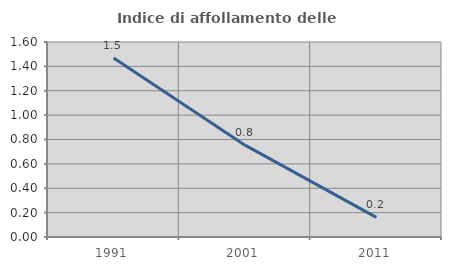
| Category | Indice di affollamento delle abitazioni  |
|---|---|
| 1991.0 | 1.469 |
| 2001.0 | 0.754 |
| 2011.0 | 0.161 |